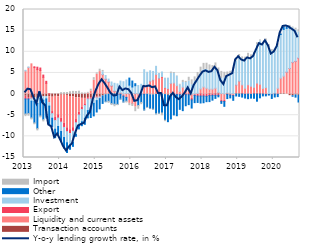
| Category | Transaction accounts | Liquidity and current assets | Export | Investment | Other | Import |
|---|---|---|---|---|---|---|
| 2013-01-01 | -0.509 | 5.466 | -0.655 | 0.157 | -3.557 | -0.62 |
| 2013-02-01 | -0.821 | 6.307 | -0.351 | 0.101 | -3.442 | -0.636 |
| 2013-03-01 | -0.908 | 7.144 | -0.174 | -0.604 | -3.955 | -0.473 |
| 2013-04-01 | -0.906 | 6.265 | 0.188 | -0.805 | -5.11 | -0.441 |
| 2013-05-01 | -1.028 | 5.791 | 0.566 | -1.205 | -5.942 | -0.539 |
| 2013-06-01 | -0.715 | 5.566 | 0.59 | -0.246 | -4.209 | -0.467 |
| 2013-07-01 | -0.656 | 3.962 | 0.527 | -0.788 | -4.619 | -0.522 |
| 2013-08-01 | -0.571 | 2.543 | 0.475 | -0.574 | -4.455 | -0.211 |
| 2013-09-01 | -0.597 | -1.463 | 0.046 | -0.788 | -4.325 | -0.17 |
| 2013-10-01 | -0.731 | -3.405 | -0.479 | -1.101 | -1.998 | -0.034 |
| 2013-11-01 | -0.534 | -5.012 | -0.697 | -2.071 | -1.999 | 0.032 |
| 2013-12-01 | -0.631 | -4.25 | -0.793 | -2 | -1.812 | 0.042 |
| 2014-01-01 | -0.248 | -5.468 | -0.921 | -2.223 | -2.314 | 0.338 |
| 2014-02-01 | -0.244 | -6.677 | -0.967 | -2.397 | -2.478 | 0.345 |
| 2014-03-01 | -0.312 | -7.664 | -0.914 | -2.634 | -2.299 | 0.368 |
| 2014-04-01 | -0.598 | -7.82 | -0.878 | -2.779 | -0.977 | 0.561 |
| 2014-05-01 | -0.678 | -7.271 | -0.835 | -2.63 | -0.953 | 0.634 |
| 2014-06-01 | -0.89 | -5.133 | -0.763 | -2.735 | -0.458 | 0.61 |
| 2014-07-01 | -0.861 | -3.427 | -0.672 | -2.518 | -0.758 | 0.681 |
| 2014-08-01 | -1.004 | -2.174 | -0.467 | -2.918 | -0.917 | 0.276 |
| 2014-09-01 | -1.021 | -1.308 | -0.375 | -3.018 | -1.426 | 0.243 |
| 2014-10-01 | -0.819 | 0.161 | -0.34 | -2.752 | -1.718 | 0.247 |
| 2014-11-01 | -0.858 | 0.695 | -0.279 | -2.093 | -2.317 | 0.459 |
| 2014-12-01 | -0.577 | 3.263 | -0.264 | -1.35 | -2.967 | 0.625 |
| 2015-01-01 | -0.712 | 4.673 | -0.142 | -0.704 | -2.68 | 0.34 |
| 2015-02-01 | -0.565 | 5.321 | -0.111 | -0.407 | -2.409 | 0.553 |
| 2015-03-01 | -0.434 | 4.59 | 0.008 | 0.669 | -1.773 | 0.324 |
| 2015-04-01 | -0.175 | 3.498 | 0.044 | 0.845 | -1.638 | -0.132 |
| 2015-05-01 | -0.054 | 2.82 | 0.068 | 0.654 | -1.651 | -0.488 |
| 2015-06-01 | 0.05 | 1.84 | 0.063 | 0.904 | -2.258 | -0.459 |
| 2015-07-01 | 0.129 | 0.502 | 0.07 | 1.849 | -2.403 | -0.592 |
| 2015-08-01 | 0.104 | 0.009 | -0.067 | 2.291 | -2.376 | -0.307 |
| 2015-09-01 | 0.112 | 0.208 | -0.055 | 2.751 | -1.148 | -0.214 |
| 2015-10-01 | 0.038 | -0.411 | -0.06 | 2.883 | -1.421 | -0.215 |
| 2015-11-01 | 0.131 | -0.703 | -0.076 | 3.2 | -0.895 | -0.44 |
| 2015-12-01 | 0.06 | -2.198 | 0.008 | 2.045 | 1.664 | -0.542 |
| 2016-01-01 | 0.112 | -2.269 | -0.03 | 1.566 | 1.404 | -0.65 |
| 2016-02-01 | 0.086 | -3.097 | 0.005 | 1.894 | 0.462 | -1.069 |
| 2016-03-01 | 0.054 | -1.187 | -0.022 | 1.97 | -1.494 | -0.878 |
| 2016-04-01 | 0.002 | 0.259 | -0.024 | 2.055 | -1.952 | -0.542 |
| 2016-05-01 | -0.049 | 2.232 | -0.014 | 3.525 | -3.719 | -0.201 |
| 2016-06-01 | -0.049 | 2.038 | 0.004 | 3.11 | -3.101 | -0.262 |
| 2016-07-01 | -0.188 | 3.046 | 0.004 | 2.456 | -3.237 | -0.159 |
| 2016-08-01 | -0.222 | 3.353 | 0.003 | 1.994 | -3.361 | -0.259 |
| 2016-09-01 | -0.107 | 4.637 | 0.003 | 1.923 | -4.549 | -0.209 |
| 2016-10-01 | -0.069 | 3.752 | 0.02 | 1.099 | -4.471 | -0.197 |
| 2016-11-01 | 0.003 | 4.032 | 0.118 | 1.076 | -4.499 | -0.6 |
| 2016-12-01 | -0.126 | 1.493 | 0.07 | 2.199 | -6.059 | -0.332 |
| 2017-01-01 | -0.287 | 1.255 | 0.034 | 2.468 | -6.239 | 0.016 |
| 2017-02-01 | -0.028 | 2.502 | 0.033 | 2.337 | -5.845 | 0.328 |
| 2017-03-01 | -0.212 | 2.639 | -0.061 | 2.218 | -4.66 | 0.242 |
| 2017-04-01 | 0.006 | 1.986 | -0.118 | 2.178 | -5.005 | 0.123 |
| 2017-05-01 | -0.021 | 0.622 | -0.131 | 1.488 | -3.457 | 0.202 |
| 2017-06-01 | -0.058 | 1.637 | -0.146 | 1.1 | -3.715 | 0.504 |
| 2017-07-01 | 0.066 | 0.742 | -0.146 | 1.936 | -2.615 | 0.257 |
| 2017-08-01 | 0.095 | 1.091 | -0.147 | 1.891 | -2.348 | 0.891 |
| 2017-09-01 | -0.033 | -1.003 | -0.338 | 2.229 | -1.931 | 1.128 |
| 2017-10-01 | 0.035 | -0.002 | -0.349 | 2.95 | -1.675 | 1.076 |
| 2017-11-01 | -0.038 | 0.191 | -0.423 | 3.298 | -1.519 | 1.614 |
| 2017-12-01 | 0.111 | 1.115 | -0.472 | 3.68 | -1.636 | 1.452 |
| 2018-01-01 | -0.017 | 1.678 | -0.449 | 4.093 | -1.582 | 1.485 |
| 2018-02-01 | -0.076 | 1.395 | -0.446 | 4.432 | -1.275 | 1.464 |
| 2018-03-01 | 0.181 | 0.968 | -0.353 | 4.465 | -1.426 | 1.286 |
| 2018-04-01 | 0.071 | 1.103 | -0.297 | 4.181 | -1.141 | 1.381 |
| 2018-05-01 | 0.137 | 1.251 | -0.296 | 4.4 | -0.726 | 1.574 |
| 2018-06-01 | 0.284 | 0.134 | -0.277 | 4.559 | -0.377 | 1.191 |
| 2018-07-01 | 0.145 | -1.444 | -0.282 | 3.523 | -0.476 | 1.691 |
| 2018-08-01 | 0.047 | -1.482 | -0.277 | 3.826 | -1.138 | 1.281 |
| 2018-09-01 | 0.187 | 0.07 | -0.088 | 3.999 | -0.981 | 0.962 |
| 2018-10-01 | 0.165 | -0.154 | -0.086 | 4.312 | -0.67 | 0.902 |
| 2018-11-01 | 0.151 | -0.294 | -0.083 | 5.778 | -1.1 | 0.383 |
| 2018-12-01 | 0.121 | 2.002 | 0.005 | 5.72 | -0.449 | 0.69 |
| 2019-01-01 | 0.084 | 2.964 | 0.003 | 5.799 | -0.532 | 0.511 |
| 2019-02-01 | 0.122 | 2.071 | -0.001 | 6.112 | -0.71 | 0.483 |
| 2019-03-01 | -0.043 | 1.384 | -0.007 | 6.432 | -0.89 | 0.926 |
| 2019-04-01 | -0.017 | 2.209 | -0.007 | 6.458 | -1.061 | 0.975 |
| 2019-05-01 | -0.065 | 1.864 | -0.007 | 6.82 | -0.881 | 0.597 |
| 2019-06-01 | 0.071 | 1.52 | -0.011 | 7.649 | -0.954 | 0.599 |
| 2019-07-01 | 0.174 | 2.439 | -0.011 | 8.965 | -1.672 | 0.577 |
| 2019-08-01 | 0.114 | 2.222 | -0.011 | 10.233 | -0.877 | 0.238 |
| 2019-09-01 | 0.013 | 1.329 | -0.011 | 10.479 | -0.423 | 0.206 |
| 2019-10-31 | -0.066 | 1.541 | -0.01 | 11.047 | -0.342 | 0.436 |
| 2019-11-30 | -0.091 | 0.084 | -0.01 | 10.759 | -0.137 | 0.843 |
| 2019-12-31 | -0.112 | -0.022 | -0.01 | 10.098 | -0.896 | 0.408 |
| 2020-01-31 | 0.054 | 0.141 | -0.01 | 9.923 | -0.677 | 0.532 |
| 2020-02-29 | -0.038 | 1.384 | -0.005 | 9.987 | -0.557 | 0.483 |
| 2020-03-31 | 0.142 | 3.609 | 0 | 10.341 | 0.142 | 0.224 |
| 2020-04-30 | 0.16 | 4.087 | 0 | 11.041 | 0.559 | 0.149 |
| 2020-05-31 | -0.034 | 5.187 | 0.005 | 10.338 | 0.308 | 0.306 |
| 2020-06-30 | -0.38 | 6.042 | 0.022 | 9.534 | 0.223 | 0.414 |
| 2020-07-31 | -0.388 | 7.439 | 0.076 | 8.138 | -0.127 | 0.2 |
| 2020-08-31 | -0.211 | 7.694 | 0.075 | 7.348 | -0.512 | 0.459 |
| 2020-09-30 | -0.276 | 8.456 | 0.072 | 6.174 | -1.624 | 0.508 |